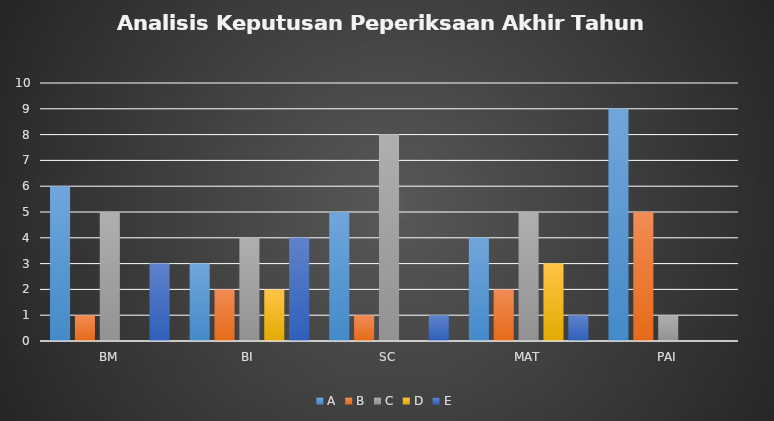
| Category | A | B | C | D | E |
|---|---|---|---|---|---|
| BM | 6 | 1 | 5 | 0 | 3 |
| BI | 3 | 2 | 4 | 2 | 4 |
| SC | 5 | 1 | 8 | 0 | 1 |
| MAT | 4 | 2 | 5 | 3 | 1 |
| PAI | 9 | 5 | 1 | 0 | 0 |